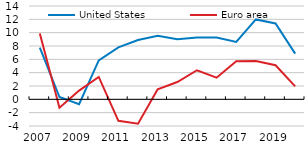
| Category | United States | Euro area |
|---|---|---|
| 2007.0 | 7.75 | 9.892 |
| 2008.0 | 0.35 | -1.253 |
| 2009.0 | -0.73 | 1.317 |
| 2010.0 | 5.85 | 3.356 |
| 2011.0 | 7.79 | -3.223 |
| 2012.0 | 8.9 | -3.667 |
| 2013.0 | 9.54 | 1.511 |
| 2014.0 | 9.01 | 2.598 |
| 2015.0 | 9.29 | 4.363 |
| 2016.0 | 9.27 | 3.243 |
| 2017.0 | 8.6 | 5.698 |
| 2018.0 | 11.98 | 5.761 |
| 2019.0 | 11.38 | 5.108 |
| 2020.0 | 6.85 | 1.937 |